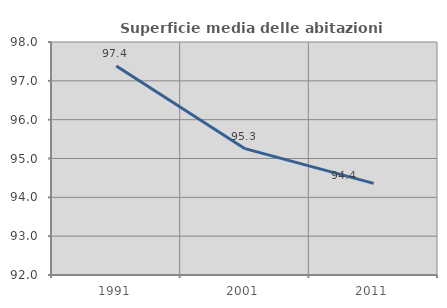
| Category | Superficie media delle abitazioni occupate |
|---|---|
| 1991.0 | 97.384 |
| 2001.0 | 95.253 |
| 2011.0 | 94.359 |